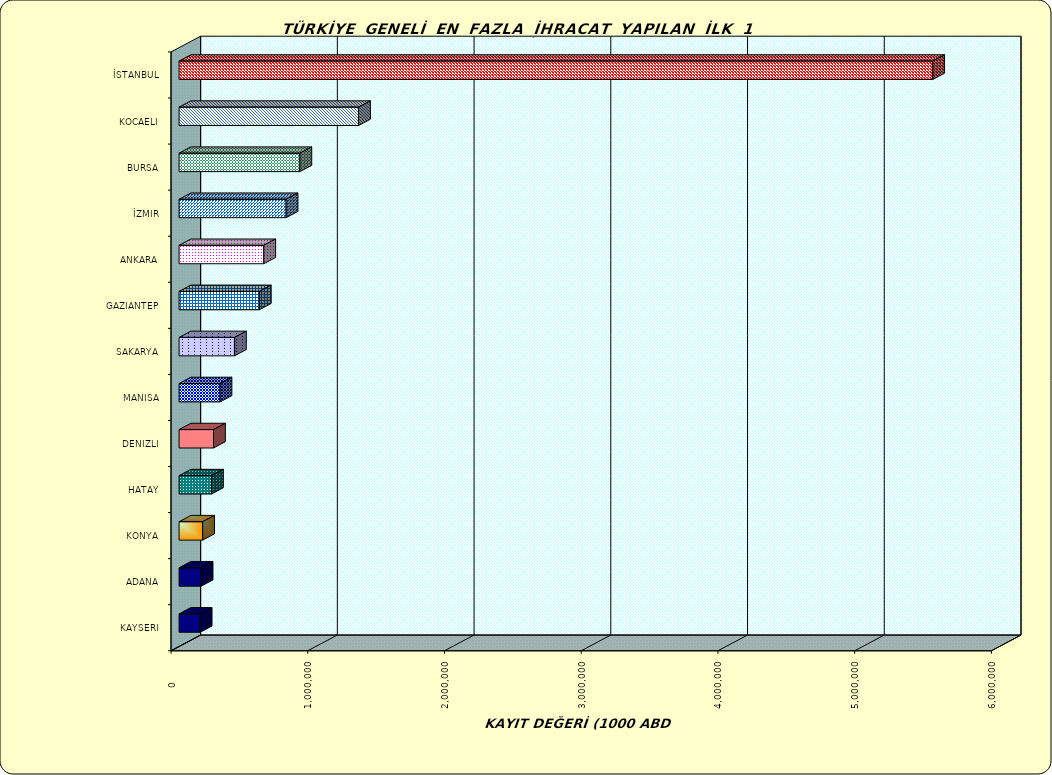
| Category | Series 0 |
|---|---|
| İSTANBUL | 5511831.04 |
| KOCAELI | 1312543.177 |
| BURSA | 883590.448 |
| İZMIR | 782780.498 |
| ANKARA | 619581.912 |
| GAZIANTEP | 586858.692 |
| SAKARYA | 405050.253 |
| MANISA | 299500.384 |
| DENIZLI | 251908.278 |
| HATAY | 237233.029 |
| KONYA | 172539.132 |
| ADANA | 161151.809 |
| KAYSERI | 154275.232 |